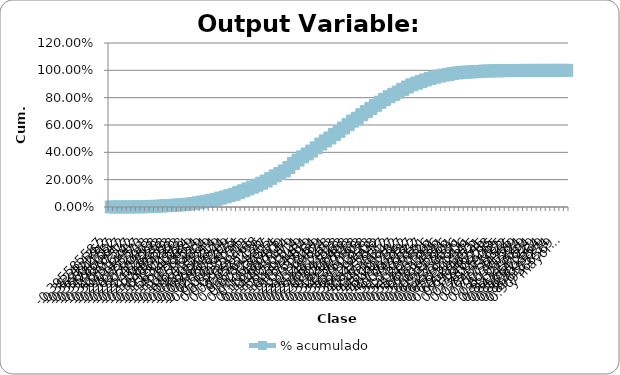
| Category | % acumulado |
|---|---|
| -0,40 | 0 |
| -0,38 | 0 |
| -0,37 | 0 |
| -0,36 | 0 |
| -0,34 | 0 |
| -0,33 | 0.001 |
| -0,32 | 0.001 |
| -0,30 | 0.002 |
| -0,29 | 0.003 |
| -0,28 | 0.004 |
| -0,26 | 0.005 |
| -0,25 | 0.008 |
| -0,24 | 0.009 |
| -0,22 | 0.011 |
| -0,21 | 0.013 |
| -0,20 | 0.015 |
| -0,18 | 0.018 |
| -0,17 | 0.021 |
| -0,16 | 0.025 |
| -0,15 | 0.03 |
| -0,13 | 0.036 |
| -0,12 | 0.042 |
| -0,11 | 0.049 |
| -0,09 | 0.056 |
| -0,08 | 0.065 |
| -0,07 | 0.074 |
| -0,05 | 0.083 |
| -0,04 | 0.093 |
| -0,03 | 0.106 |
| -0,01 | 0.118 |
| 0,00 | 0.132 |
| 0,01 | 0.145 |
| 0,03 | 0.16 |
| 0,04 | 0.174 |
| 0,05 | 0.19 |
| 0,07 | 0.209 |
| 0,08 | 0.228 |
| 0,09 | 0.245 |
| 0,11 | 0.264 |
| 0,12 | 0.289 |
| 0,13 | 0.319 |
| 0,14 | 0.343 |
| 0,16 | 0.367 |
| 0,17 | 0.388 |
| 0,18 | 0.409 |
| 0,20 | 0.434 |
| 0,21 | 0.461 |
| 0,22 | 0.484 |
| 0,24 | 0.505 |
| 0,25 | 0.531 |
| 0,26 | 0.553 |
| 0,28 | 0.578 |
| 0,29 | 0.603 |
| 0,30 | 0.629 |
| 0,32 | 0.649 |
| 0,33 | 0.675 |
| 0,34 | 0.698 |
| 0,36 | 0.721 |
| 0,37 | 0.744 |
| 0,38 | 0.766 |
| 0,40 | 0.787 |
| 0,41 | 0.807 |
| 0,42 | 0.824 |
| 0,43 | 0.841 |
| 0,45 | 0.861 |
| 0,46 | 0.878 |
| 0,47 | 0.894 |
| 0,49 | 0.906 |
| 0,50 | 0.918 |
| 0,51 | 0.93 |
| 0,53 | 0.94 |
| 0,54 | 0.95 |
| 0,55 | 0.958 |
| 0,57 | 0.965 |
| 0,58 | 0.97 |
| 0,59 | 0.977 |
| 0,61 | 0.981 |
| 0,62 | 0.985 |
| 0,63 | 0.987 |
| 0,65 | 0.988 |
| 0,66 | 0.99 |
| 0,67 | 0.992 |
| 0,69 | 0.995 |
| 0,70 | 0.996 |
| 0,71 | 0.996 |
| 0,72 | 0.997 |
| 0,74 | 0.997 |
| 0,75 | 0.998 |
| 0,76 | 0.998 |
| 0,78 | 0.999 |
| 0,79 | 0.999 |
| 0,80 | 0.999 |
| 0,82 | 0.999 |
| 0,83 | 1 |
| 0,84 | 1 |
| 0,86 | 1 |
| 0,87 | 1 |
| 0,88 | 1 |
| 0,90 | 1 |
| 0,91 | 1 |
| y mayor... | 1 |